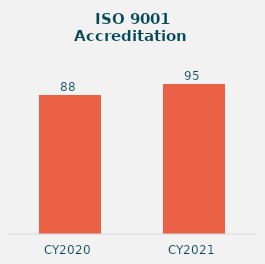
| Category | Series 0 |
|---|---|
| CY2020 | 88 |
| CY2021 | 95 |